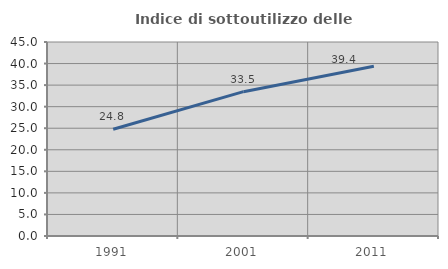
| Category | Indice di sottoutilizzo delle abitazioni  |
|---|---|
| 1991.0 | 24.761 |
| 2001.0 | 33.476 |
| 2011.0 | 39.387 |